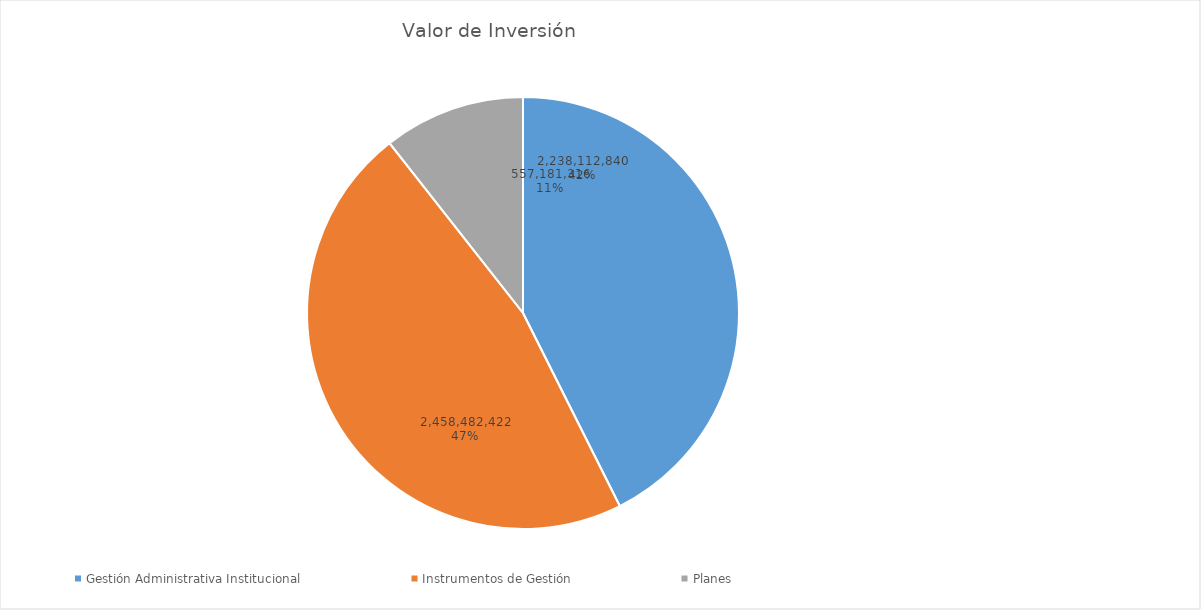
| Category | Valor de Inversión | Porcentaje de Ejecución dentro de la Actividad |
|---|---|---|
| Gestión Administrativa Institucional | 2238112840 | 6 |
| Instrumentos de Gestión | 2458482422 | 8 |
| Planes | 557181316 | 5 |